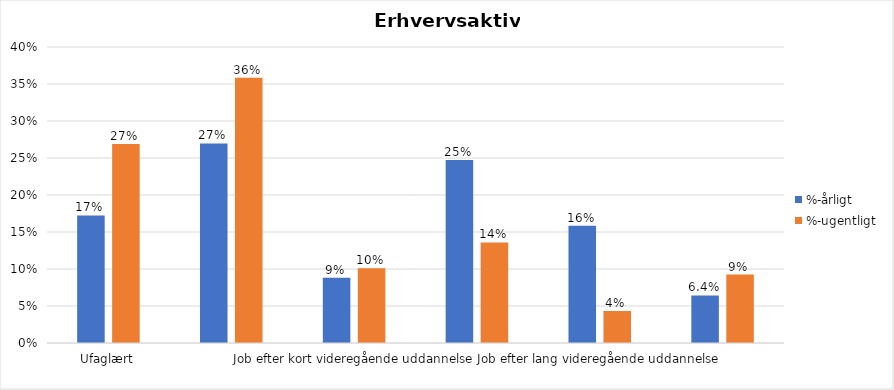
| Category | %-årligt | %-ugentligt |
|---|---|---|
| Ufaglært | 0.172 | 0.269 |
| Erhvervsfagligt job | 0.27 | 0.358 |
| Job efter kort videregående uddannelse | 0.088 | 0.101 |
| Job efter mellemlang videregående uddannelse | 0.247 | 0.136 |
| Job efter lang videregående uddannelse | 0.158 | 0.043 |
| Selvstændig | 0.064 | 0.092 |